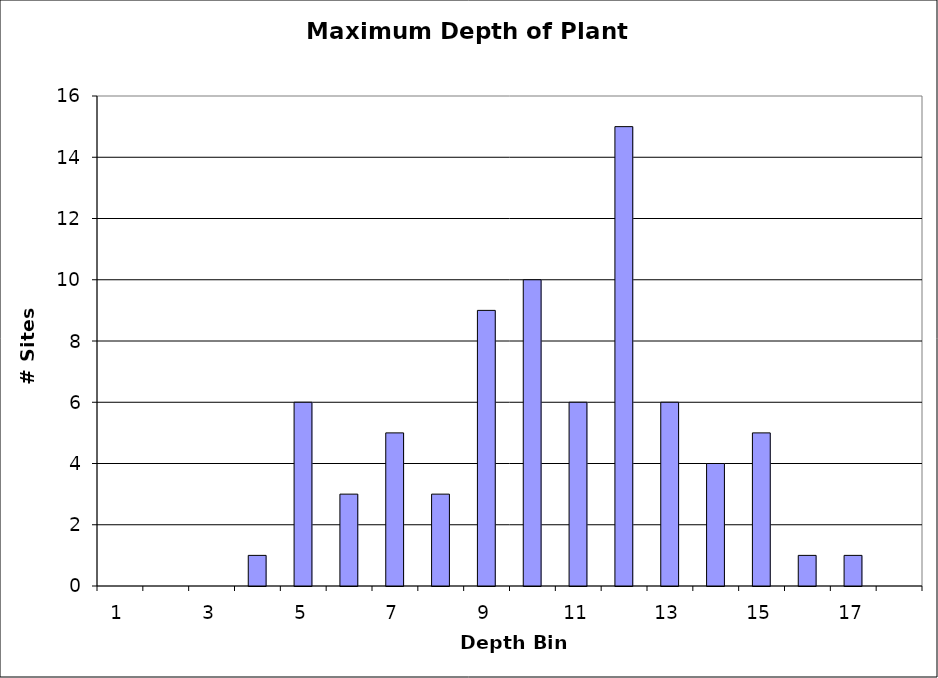
| Category | Series 0 |
|---|---|
| 1.0 | 0 |
| 2.0 | 0 |
| 3.0 | 0 |
| 4.0 | 1 |
| 5.0 | 6 |
| 6.0 | 3 |
| 7.0 | 5 |
| 8.0 | 3 |
| 9.0 | 9 |
| 10.0 | 10 |
| 11.0 | 6 |
| 12.0 | 15 |
| 13.0 | 6 |
| 14.0 | 4 |
| 15.0 | 5 |
| 16.0 | 1 |
| 17.0 | 1 |
| 18.0 | 0 |